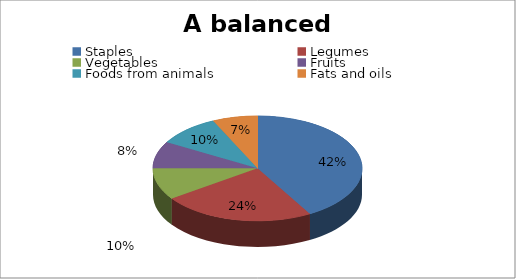
| Category | Series 0 |
|---|---|
| Staples | 150 |
| Legumes | 85 |
| Vegetables | 35 |
| Fruits | 30 |
| Foods from animals  | 35 |
| Fats and oils | 25 |